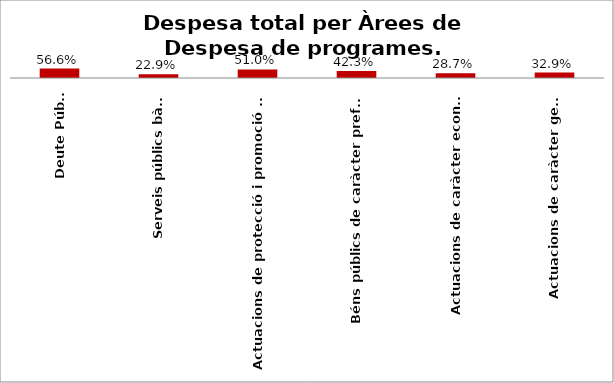
| Category | Series 0 |
|---|---|
| Deute Públic | 0.566 |
| Serveis públics bàsics | 0.229 |
| Actuacions de protecció i promoció social | 0.51 |
| Béns públics de caràcter preferent | 0.423 |
| Actuacions de caràcter econòmic | 0.287 |
| Actuacions de caràcter general | 0.329 |